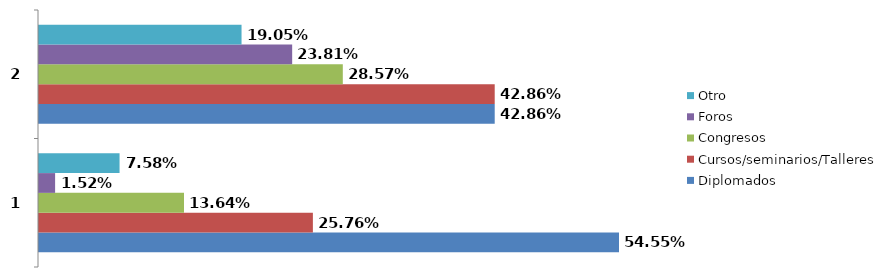
| Category | Diplomados | Cursos/seminarios/Talleres | Congresos | Foros | Otro |
|---|---|---|---|---|---|
| 0 | 0.545 | 0.258 | 0.136 | 0.015 | 0.076 |
| 1 | 0.429 | 0.429 | 0.286 | 0.238 | 0.19 |